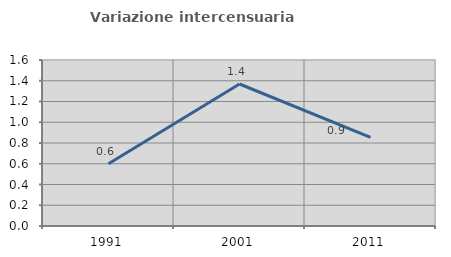
| Category | Variazione intercensuaria annua |
|---|---|
| 1991.0 | 0.6 |
| 2001.0 | 1.369 |
| 2011.0 | 0.855 |